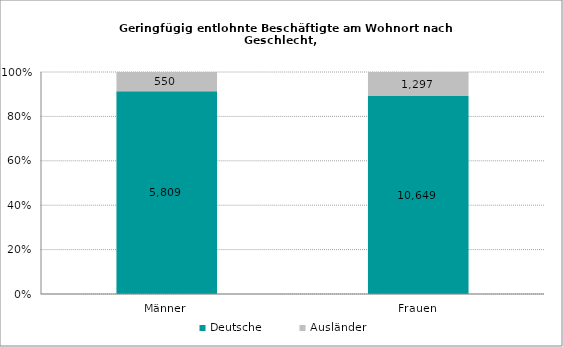
| Category | Deutsche | Ausländer |
|---|---|---|
| Männer | 5809 | 550 |
| Frauen | 10649 | 1297 |